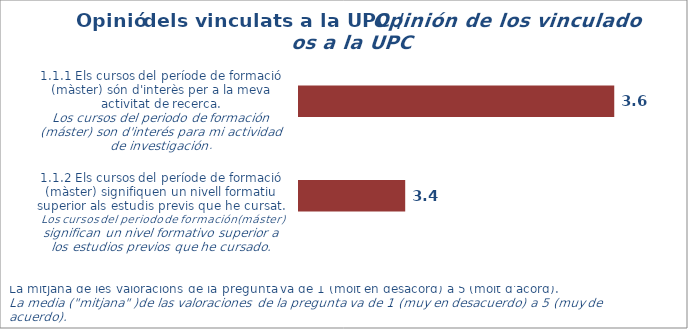
| Category | Mitjana |
|---|---|
| 1.1.1 Els cursos del període de formació (màster són d'interès per a la meva activitat de recerca
Los cursos del periodo de formación (máster) son de interés para mi actividad de investigación. | 3.644 |
| 1.1.2 Els cursos del període de formació (màster) signifiquen un nivell formatiu superior als estudis previs que he cursat | 3.383 |